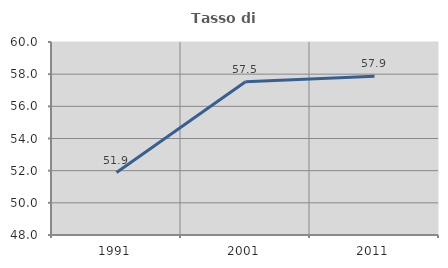
| Category | Tasso di occupazione   |
|---|---|
| 1991.0 | 51.886 |
| 2001.0 | 57.524 |
| 2011.0 | 57.876 |